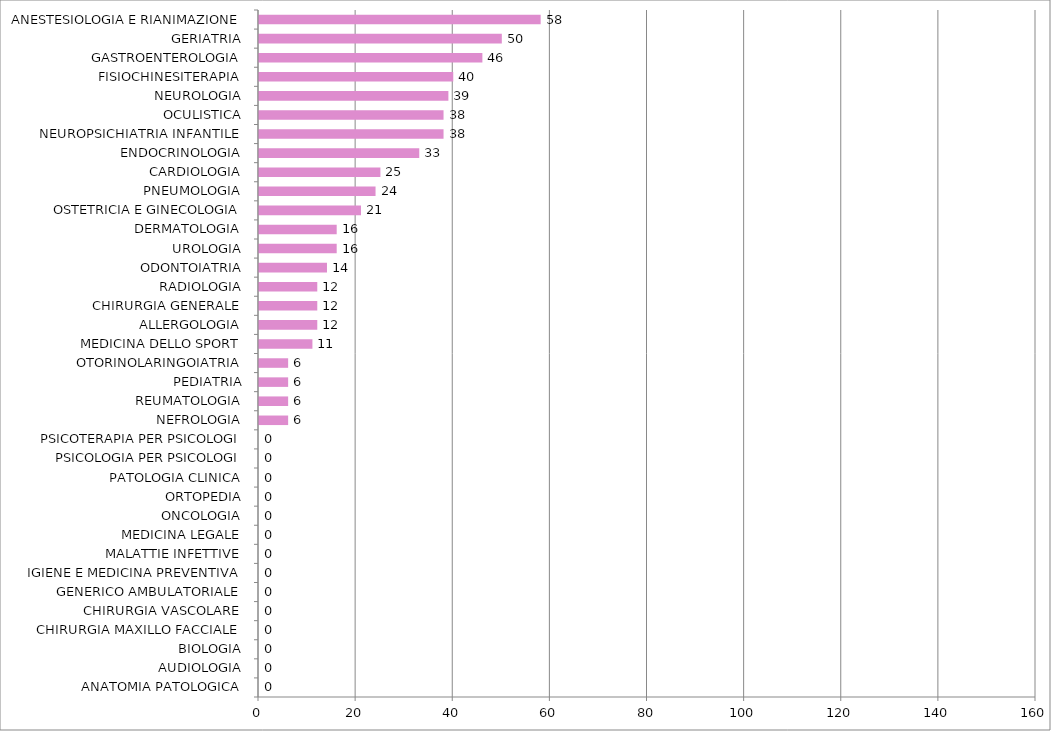
| Category | Series 0 |
|---|---|
| ANATOMIA PATOLOGICA | 0 |
| AUDIOLOGIA | 0 |
| BIOLOGIA | 0 |
| CHIRURGIA MAXILLO FACCIALE | 0 |
| CHIRURGIA VASCOLARE | 0 |
| GENERICO AMBULATORIALE | 0 |
| IGIENE E MEDICINA PREVENTIVA | 0 |
| MALATTIE INFETTIVE | 0 |
| MEDICINA LEGALE | 0 |
| ONCOLOGIA | 0 |
| ORTOPEDIA | 0 |
| PATOLOGIA CLINICA | 0 |
| PSICOLOGIA PER PSICOLOGI | 0 |
| PSICOTERAPIA PER PSICOLOGI | 0 |
| NEFROLOGIA | 6 |
| REUMATOLOGIA | 6 |
| PEDIATRIA | 6 |
| OTORINOLARINGOIATRIA | 6 |
| MEDICINA DELLO SPORT | 11 |
| ALLERGOLOGIA | 12 |
| CHIRURGIA GENERALE | 12 |
| RADIOLOGIA | 12 |
| ODONTOIATRIA | 14 |
| UROLOGIA | 16 |
| DERMATOLOGIA | 16 |
| OSTETRICIA E GINECOLOGIA | 21 |
| PNEUMOLOGIA | 24 |
| CARDIOLOGIA | 25 |
| ENDOCRINOLOGIA | 33 |
| NEUROPSICHIATRIA INFANTILE | 38 |
| OCULISTICA | 38 |
| NEUROLOGIA | 39 |
| FISIOCHINESITERAPIA | 40 |
| GASTROENTEROLOGIA | 46 |
| GERIATRIA | 50 |
| ANESTESIOLOGIA E RIANIMAZIONE | 58 |